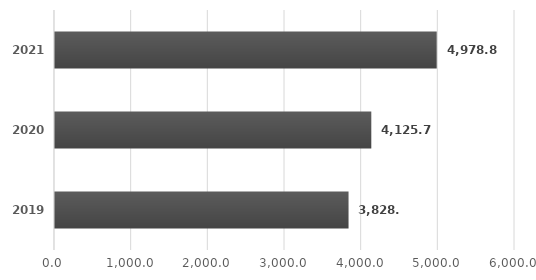
| Category | Series 0 |
|---|---|
| 2019.0 | 3828.83 |
| 2020.0 | 4125.7 |
| 2021.0 | 4978.8 |